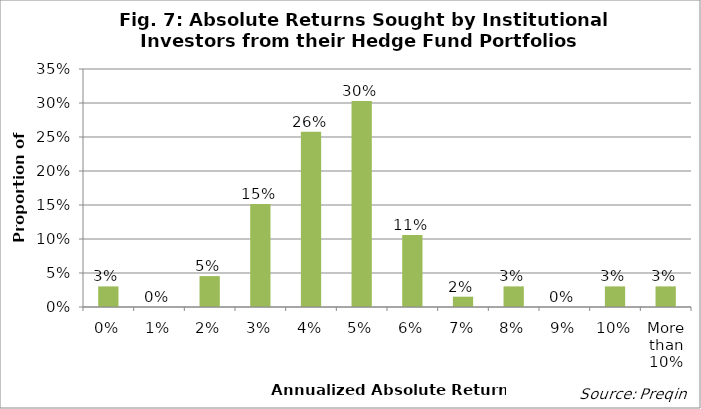
| Category | Proportion of Respondents |
|---|---|
| 0% | 0.03 |
| 1% | 0 |
| 2% | 0.045 |
| 3% | 0.152 |
| 4% | 0.258 |
| 5% | 0.303 |
| 6% | 0.106 |
| 7% | 0.015 |
| 8% | 0.03 |
| 9% | 0 |
| 10% | 0.03 |
| More than 10% | 0.03 |